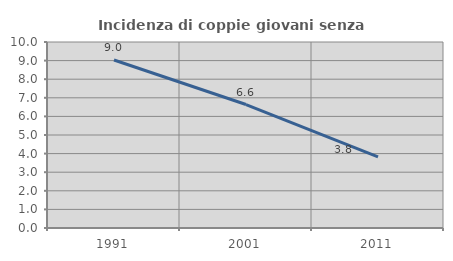
| Category | Incidenza di coppie giovani senza figli |
|---|---|
| 1991.0 | 9.031 |
| 2001.0 | 6.638 |
| 2011.0 | 3.818 |